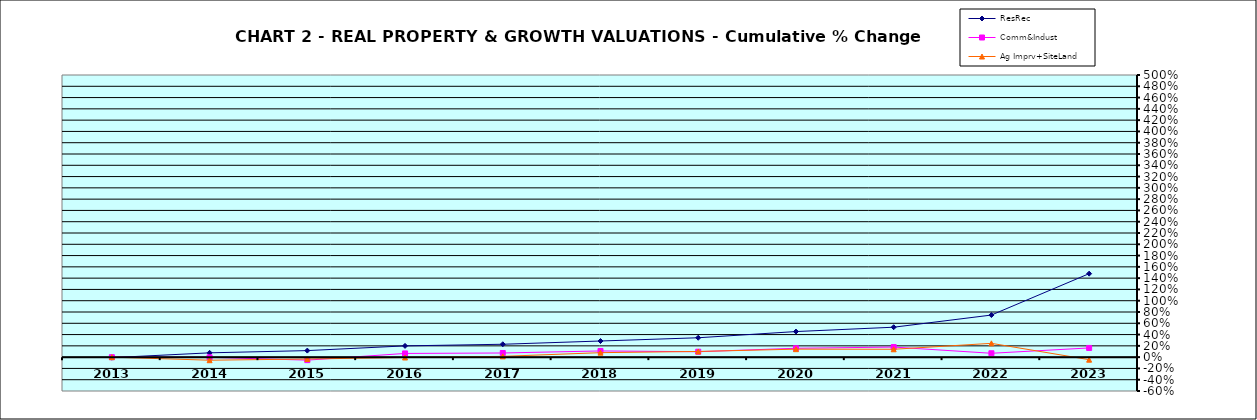
| Category | ResRec | Comm&Indust | Ag Imprv+SiteLand |
|---|---|---|---|
| 2013.0 | -0.009 | -0.001 | 0 |
| 2014.0 | 0.076 | -0.003 | -0.054 |
| 2015.0 | 0.116 | -0.053 | -0.033 |
| 2016.0 | 0.2 | 0.066 | -0.006 |
| 2017.0 | 0.228 | 0.074 | 0.014 |
| 2018.0 | 0.286 | 0.11 | 0.079 |
| 2019.0 | 0.344 | 0.096 | 0.101 |
| 2020.0 | 0.454 | 0.157 | 0.141 |
| 2021.0 | 0.53 | 0.179 | 0.14 |
| 2022.0 | 0.746 | 0.069 | 0.245 |
| 2023.0 | 1.48 | 0.163 | -0.045 |